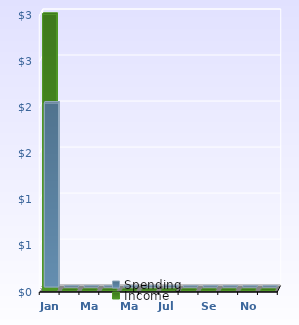
| Category | Spending | Income |
|---|---|---|
| Jan | 2 | 3 |
| Feb | 0 | 0 |
| Mar | 0 | 0 |
| Apr | 0 | 0 |
| May | 0 | 0 |
| Jun | 0 | 0 |
| Jul | 0 | 0 |
| Aug | 0 | 0 |
| Sep | 0 | 0 |
| Oct | 0 | 0 |
| Nov | 0 | 0 |
| Dec | 0 | 0 |